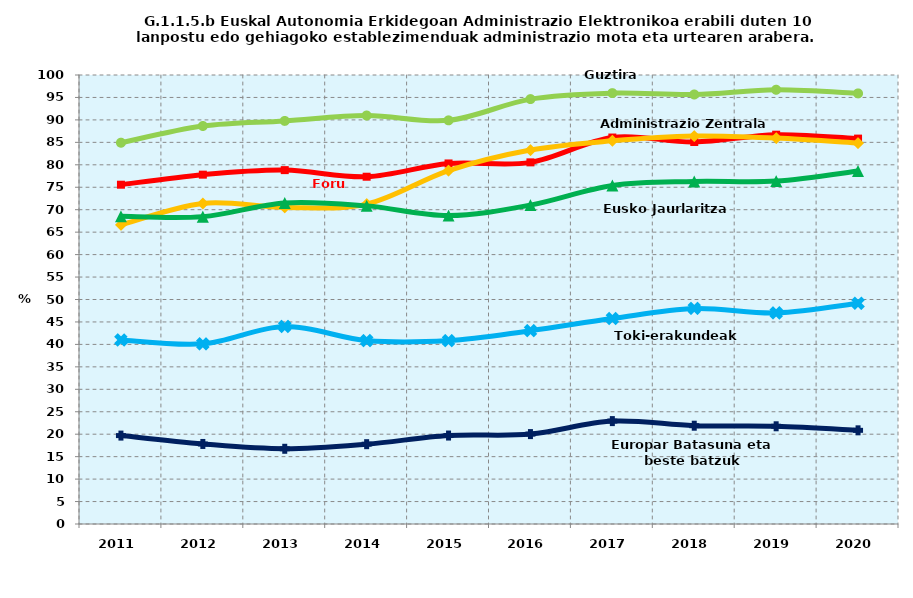
| Category | Guztira | Foru aldundiak | Administrazio Zentrala | Eusko Jaurlaritza | Toki-erakundeak | Europar Batasuna eta beste batzuk |
|---|---|---|---|---|---|---|
| 2011.0 | 84.919 | 75.566 | 66.635 | 68.518 | 40.99 | 19.69 |
| 2012.0 | 88.639 | 77.803 | 71.399 | 68.457 | 40.12 | 17.825 |
| 2013.0 | 89.774 | 78.814 | 70.5 | 71.513 | 43.99 | 16.752 |
| 2014.0 | 90.972 | 77.343 | 71.245 | 70.852 | 40.845 | 17.779 |
| 2015.0 | 89.9 | 80.3 | 78.7 | 68.7 | 40.845 | 19.7 |
| 2016.0 | 94.63 | 80.543 | 83.285 | 71.025 | 43.062 | 20.023 |
| 2017.0 | 95.964 | 86.074 | 85.341 | 75.396 | 45.758 | 22.918 |
| 2018.0 | 95.655 | 85.076 | 86.41 | 76.28 | 48.003 | 21.89 |
| 2019.0 | 96.71 | 86.706 | 85.942 | 76.372 | 47.022 | 21.763 |
| 2020.0 | 95.9 | 85.833 | 84.824 | 78.619 | 49.153 | 20.862 |